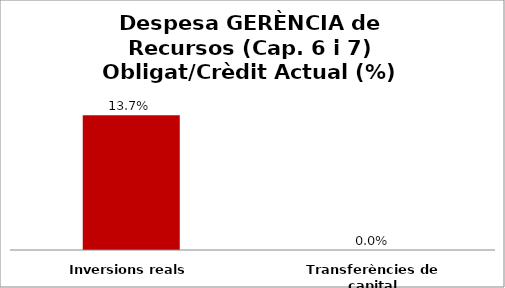
| Category | Series 0 |
|---|---|
| Inversions reals | 0.137 |
| Transferències de capital | 0 |